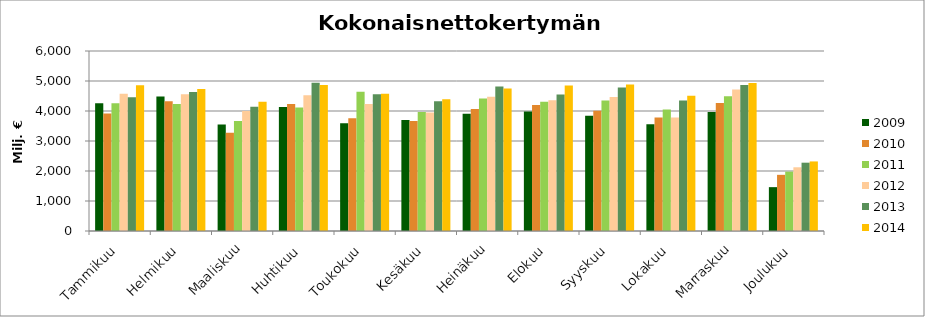
| Category | 2009 | 2010 | 2011 | 2012 | 2013 | 2014 |
|---|---|---|---|---|---|---|
| Tammikuu | 4262.104 | 3920.596 | 4254.457 | 4574.273 | 4458.574 | 4859.611 |
| Helmikuu | 4482.61 | 4324.273 | 4236.531 | 4556.683 | 4631.184 | 4733.214 |
| Maaliskuu | 3551.222 | 3273.1 | 3667.911 | 4003.705 | 4141.995 | 4307.275 |
| Huhtikuu | 4137.11 | 4235.283 | 4118.677 | 4521.853 | 4938.018 | 4869.346 |
| Toukokuu | 3589.232 | 3758.246 | 4645.002 | 4229.781 | 4554.199 | 4573.181 |
| Kesäkuu | 3701.617 | 3667.134 | 3966.073 | 3950.962 | 4320.908 | 4392.249 |
| Heinäkuu | 3908.058 | 4070.751 | 4417.867 | 4473.488 | 4813.288 | 4746.187 |
| Elokuu | 3983.999 | 4202.024 | 4310.334 | 4361.243 | 4548.338 | 4849.507 |
| Syyskuu | 3843.197 | 4009.059 | 4353.55 | 4465.954 | 4780.078 | 4883.402 |
| Lokakuu | 3558.554 | 3781.91 | 4052.329 | 3783.435 | 4353.533 | 4510.318 |
| Marraskuu | 3964.456 | 4269.91 | 4491.275 | 4716.744 | 4864.184 | 4933.92 |
| Joulukuu | 1461.632 | 1872.231 | 1978.993 | 2124.114 | 2277.179 | 2319.022 |